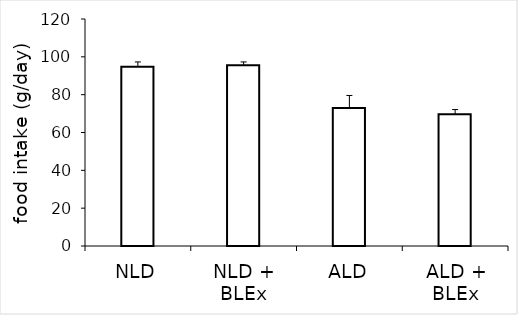
| Category | Series 0 |
|---|---|
| NLD | 94.822 |
| NLD + BLEx | 95.543 |
| ALD | 72.968 |
| ALD + BLEx | 69.582 |